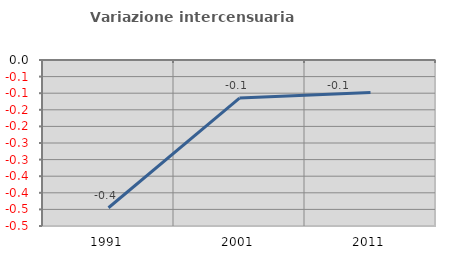
| Category | Variazione intercensuaria annua |
|---|---|
| 1991.0 | -0.445 |
| 2001.0 | -0.115 |
| 2011.0 | -0.098 |